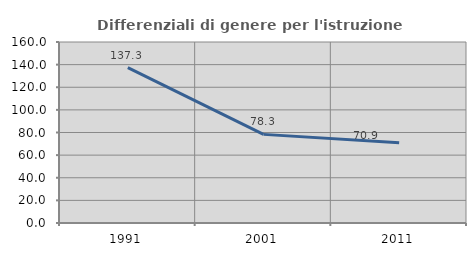
| Category | Differenziali di genere per l'istruzione superiore |
|---|---|
| 1991.0 | 137.297 |
| 2001.0 | 78.342 |
| 2011.0 | 70.892 |